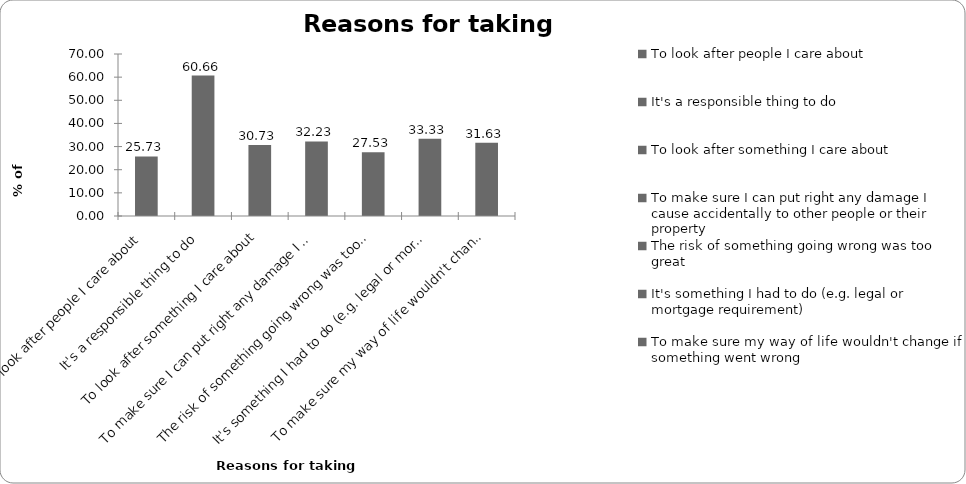
| Category | Reasons for taking insurance |
|---|---|
| To look after people I care about | 25.726 |
| It's a responsible thing to do | 60.661 |
| To look after something I care about | 30.731 |
| To make sure I can put right any damage I cause accidentally to other people or their property | 32.232 |
| The risk of something going wrong was too great | 27.528 |
| It's something I had to do (e.g. legal or mortgage requirement) | 33.333 |
| To make sure my way of life wouldn't change if something went wrong | 31.632 |